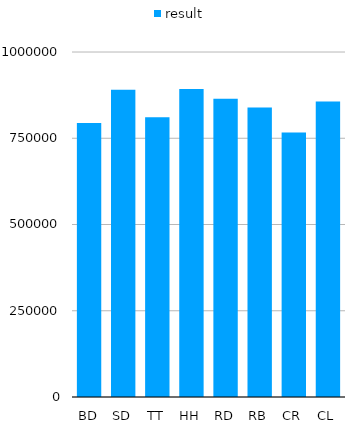
| Category | result |
|---|---|
| BD | 794222 |
| SD | 890514 |
| TT | 810928 |
| HH | 893082 |
| RD | 864166 |
| RB | 839312 |
| CR | 766747 |
| CL | 856499 |